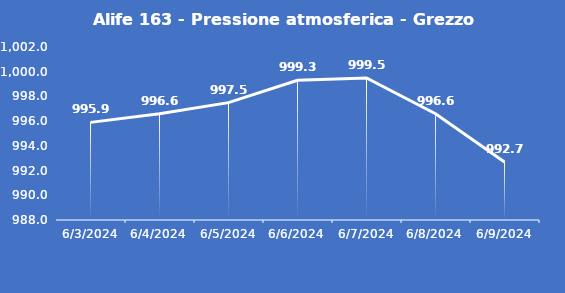
| Category | Alife 163 - Pressione atmosferica - Grezzo (hPa) |
|---|---|
| 6/3/24 | 995.9 |
| 6/4/24 | 996.6 |
| 6/5/24 | 997.5 |
| 6/6/24 | 999.3 |
| 6/7/24 | 999.5 |
| 6/8/24 | 996.6 |
| 6/9/24 | 992.7 |